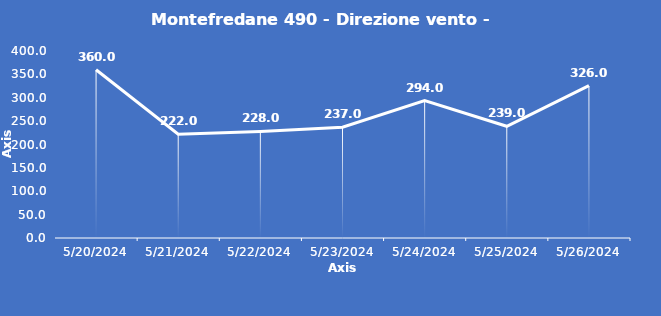
| Category | Montefredane 490 - Direzione vento - Grezzo (°N) |
|---|---|
| 5/20/24 | 360 |
| 5/21/24 | 222 |
| 5/22/24 | 228 |
| 5/23/24 | 237 |
| 5/24/24 | 294 |
| 5/25/24 | 239 |
| 5/26/24 | 326 |